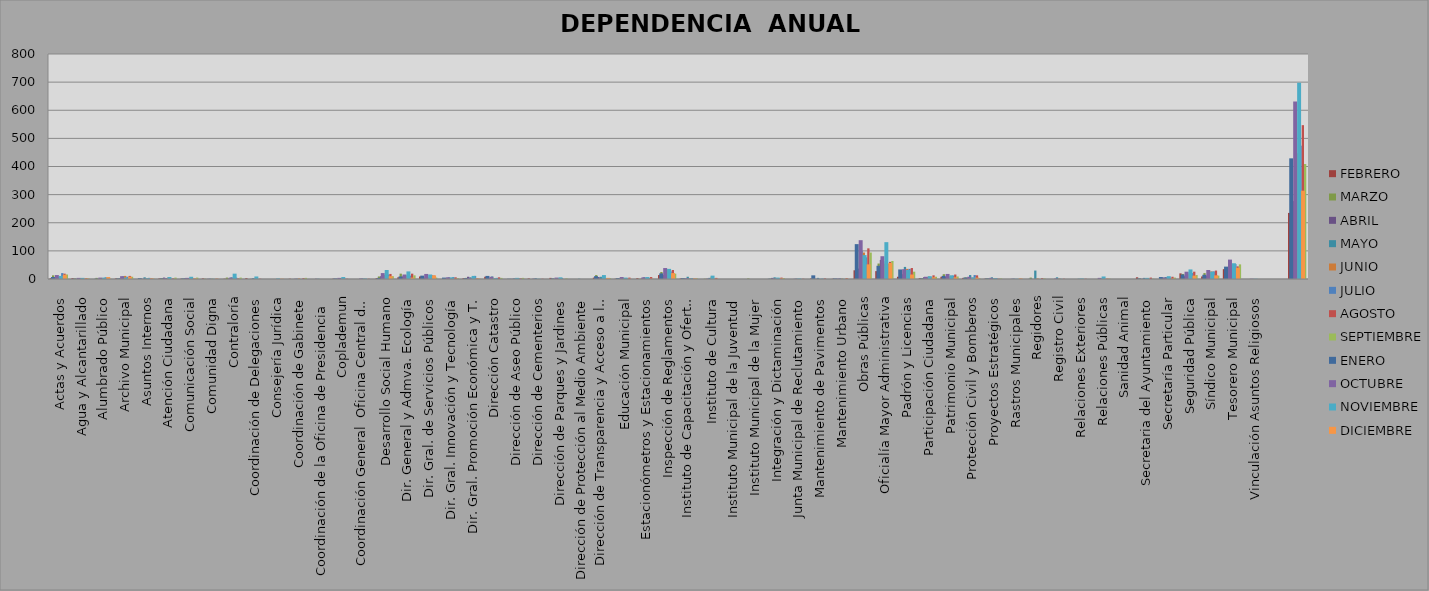
| Category | FEBRERO | MARZO | ABRIL | MAYO | JUNIO | JULIO | AGOSTO | SEPTIEMBRE |
|---|---|---|---|---|---|---|---|---|
| Actas y Acuerdos | 3 | 13 | 6 | 8 | 8 | 21 | 19 | 16 |
| Agua y Alcantarillado | 3 | 2 | 0 | 3 | 2 | 1 | 3 | 2 |
| Alumbrado Público | 0 | 4 | 1 | 3 | 1 | 6 | 1 | 1 |
| Archivo Municipal | 2 | 2 | 3 | 9 | 11 | 8 | 11 | 8 |
| Asuntos Internos | 0 | 0 | 0 | 6 | 2 | 4 | 2 | 1 |
| Atención Ciudadana | 2 | 3 | 5 | 3 | 6 | 1 | 2 | 5 |
| Comunicación Social | 1 | 1 | 3 | 3 | 3 | 2 | 1 | 5 |
| Comunidad Digna | 2 | 1 | 0 | 1 | 1 | 0 | 1 | 0 |
| Contraloría | 1 | 5 | 2 | 6 | 4 | 5 | 2 | 5 |
| Coordinación de Delegaciones | 3 | 0 | 0 | 3 | 1 | 0 | 1 | 0 |
| Consejería Jurídica | 0 | 0 | 0 | 0 | 0 | 0 | 0 | 0 |
| Coordinación de Gabinete | 1 | 0 | 0 | 1 | 2 | 0 | 3 | 4 |
| Coordinación de la Oficina de Presidencia  | 0 | 0 | 1 | 1 | 0 | 0 | 0 | 0 |
| Coplademun | 1 | 0 | 0 | 2 | 0 | 1 | 1 | 0 |
| Coordinación General  Oficina Central de Gobierno, Estrategía y opinión Pública | 0 | 0 | 0 | 1 | 1 | 0 | 1 | 0 |
| Desarrollo Social Humano | 3 | 9 | 10 | 15 | 13 | 16 | 18 | 10 |
| Dir. General y Admva. Ecología | 6 | 19 | 9 | 12 | 13 | 12 | 19 | 13 |
| Dir. Gral. de Servicios Públicos | 9 | 9 | 5 | 9 | 7 | 14 | 12 | 5 |
| Dir. Gral. Innovación y Tecnología | 0 | 2 | 2 | 6 | 0 | 7 | 6 | 3 |
| Dir. Gral. Promoción Económica y T. | 3 | 4 | 8 | 6 | 3 | 11 | 2 | 1 |
| Dirección Catastro | 8 | 4 | 2 | 9 | 3 | 4 | 6 | 4 |
| Dirección de Aseo Público | 0 | 0 | 0 | 2 | 2 | 3 | 2 | 4 |
| Dirección de Cementerios | 2 | 0 | 1 | 3 | 0 | 0 | 1 | 0 |
| Dirección de Parques y Jardines | 4 | 1 | 0 | 3 | 0 | 3 | 0 | 2 |
| Dirección de Protección al Medio Ambiente | 0 | 0 | 0 | 1 | 0 | 0 | 0 | 0 |
| Dirección de Transparencia y Acceso a la Información | 5 | 14 | 7 | 8 | 5 | 3 | 0 | 3 |
| Educación Municipal | 1 | 2 | 1 | 4 | 1 | 2 | 5 | 0 |
| Estacionómetros y Estacionamientos | 3 | 1 | 2 | 6 | 0 | 4 | 7 | 0 |
| Inspección de Reglamentos | 14 | 25 | 14 | 22 | 34 | 27 | 32 | 19 |
| Instituto de Capacitación y Oferta Educativa | 2 | 2 | 0 | 8 | 3 | 3 | 1 | 2 |
| Instituto de Cultura | 0 | 1 | 1 | 4 | 8 | 2 | 4 | 0 |
| Instituto Municipal de la Juventud | 0 | 0 | 0 | 0 | 0 | 0 | 0 | 0 |
| Instituto Municipal de la Mujer | 0 | 2 | 0 | 0 | 0 | 0 | 0 | 0 |
| Integración y Dictaminación | 0 | 1 | 4 | 6 | 3 | 3 | 5 | 3 |
| Junta Municipal de Reclutamiento | 0 | 0 | 0 | 1 | 0 | 0 | 1 | 0 |
| Mantenimiento de Pavimentos | 2 | 5 | 0 | 4 | 0 | 1 | 2 | 0 |
| Mantenimiento Urbano | 1 | 0 | 0 | 2 | 2 | 0 | 3 | 0 |
| Obras Públicas | 31 | 61 | 37 | 100 | 94 | 77 | 109 | 94 |
| Oficialía Mayor Administrativa | 28 | 55 | 68 | 63 | 55 | 54 | 61 | 64 |
| Padrón y Licencias | 8 | 31 | 17 | 43 | 36 | 36 | 39 | 26 |
| Participación Ciudadana | 3 | 3 | 7 | 6 | 9 | 7 | 13 | 8 |
| Patrimonio Municipal | 8 | 17 | 8 | 8 | 11 | 12 | 16 | 9 |
| Protección Civil y Bomberos | 4 | 6 | 5 | 14 | 5 | 14 | 13 | 3 |
| Proyectos Estratégicos | 1 | 2 | 1 | 6 | 3 | 3 | 1 | 2 |
| Rastros Municipales | 0 | 0 | 0 | 1 | 0 | 0 | 1 | 0 |
| Regidores | 0 | 5 | 0 | 30 | 2 | 0 | 3 | 2 |
| Registro Civil | 0 | 0 | 0 | 6 | 2 | 0 | 1 | 0 |
| Relaciones Exteriores | 0 | 0 | 0 | 1 | 0 | 0 | 1 | 0 |
| Relaciones Públicas | 0 | 0 | 0 | 1 | 0 | 0 | 1 | 1 |
| Sanidad Animal | 0 | 0 | 0 | 0 | 0 | 0 | 0 | 0 |
| Secretaria del Ayuntamiento | 6 | 2 | 0 | 4 | 0 | 1 | 5 | 1 |
| Secretaría Particular | 0 | 2 | 5 | 7 | 2 | 5 | 8 | 5 |
| Seguridad Pública | 20 | 18 | 10 | 24 | 17 | 21 | 26 | 14 |
| Síndico Municipal | 9 | 21 | 12 | 16 | 27 | 27 | 30 | 12 |
| Tesorero Municipal | 35 | 23 | 20 | 49 | 45 | 53 | 45 | 52 |
| Vinculación Asuntos Religiosos | 0 | 0 | 0 | 0 | 0 | 0 | 0 | 0 |